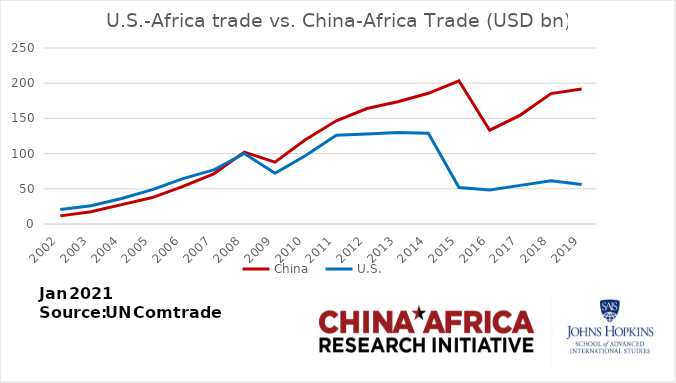
| Category | China | U.S. |
|---|---|---|
| 2002.0 | 11.527 | 20.537 |
| 2003.0 | 17.534 | 26.023 |
| 2004.0 | 27.47 | 36.302 |
| 2005.0 | 37.59 | 48.746 |
| 2006.0 | 53.378 | 64.545 |
| 2007.0 | 71.285 | 76.745 |
| 2008.0 | 102.131 | 100.079 |
| 2009.0 | 87.942 | 71.972 |
| 2010.0 | 120.073 | 97.372 |
| 2011.0 | 146.554 | 126.086 |
| 2012.0 | 164.045 | 127.947 |
| 2013.0 | 173.684 | 129.935 |
| 2014.0 | 185.691 | 129.002 |
| 2015.0 | 203.222 | 51.821 |
| 2016.0 | 133.258 | 48.187 |
| 2017.0 | 154.709 | 54.875 |
| 2018.0 | 185.286 | 61.478 |
| 2019.0 | 191.734 | 55.956 |